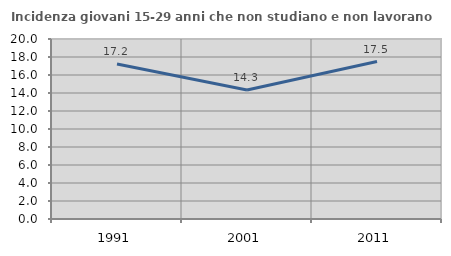
| Category | Incidenza giovani 15-29 anni che non studiano e non lavorano  |
|---|---|
| 1991.0 | 17.227 |
| 2001.0 | 14.332 |
| 2011.0 | 17.49 |